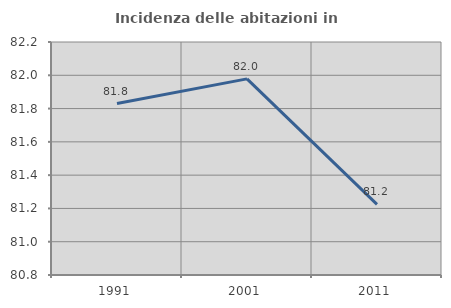
| Category | Incidenza delle abitazioni in proprietà  |
|---|---|
| 1991.0 | 81.83 |
| 2001.0 | 81.978 |
| 2011.0 | 81.224 |